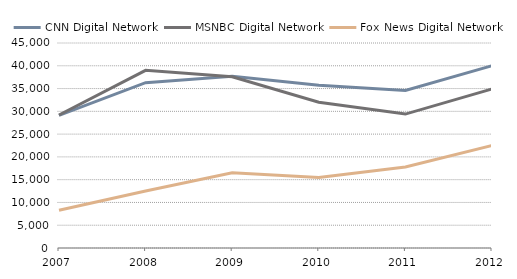
| Category | CNN Digital Network | MSNBC Digital Network | Fox News Digital Network |
|---|---|---|---|
| 2007.0 | 29100 | 29200 | 8300 |
| 2008.0 | 36300 | 39000 | 12500 |
| 2009.0 | 37700 | 37600 | 16500 |
| 2010.0 | 35700 | 32000 | 15500 |
| 2011.0 | 34600 | 29400 | 17800 |
| 2012.0 | 40000 | 34900 | 22500 |